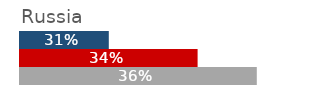
| Category | Russia |
|---|---|
| 2006 | 0.31 |
| 2011 | 0.34 |
| 2016 | 0.36 |